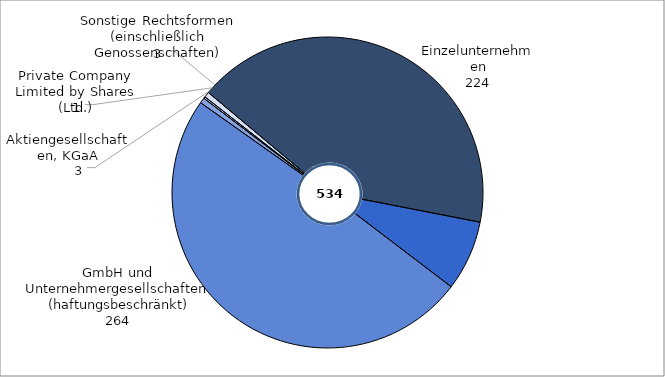
| Category | Series 0 |
|---|---|
| Einzelunternehmen | 224 |
| Personengesellschaften (OHG, KG, GbR) | 39 |
| Gesellschaften m.b.H. (einschließlich Unternehmergesellschaften (haftungsbeschränkt)) | 264 |
| Aktiengesellschaften, KGaA | 3 |
| Private Company Limited by Shares (Ltd.) | 1 |
| Sonstige Rechtsformen (einschließlich Genossenschaften) | 3 |